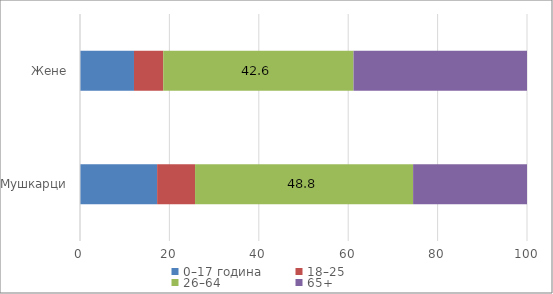
| Category | 0–17 година | 18–25 | 26–64 | 65+ |
|---|---|---|---|---|
| Мушкарци | 17.254 | 8.485 | 48.78 | 25.481 |
| Жене | 12.077 | 6.54 | 42.571 | 38.812 |